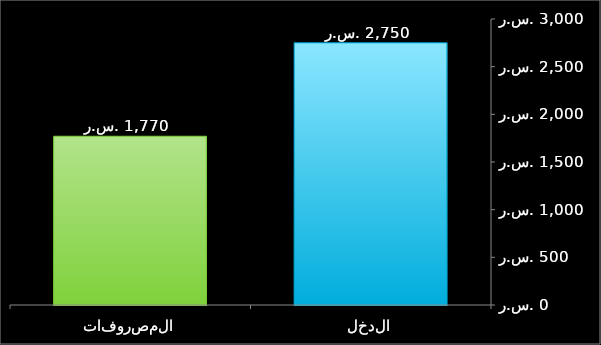
| Category | Series 0 |
|---|---|
| 0 | 2750 |
| 1 | 1770 |